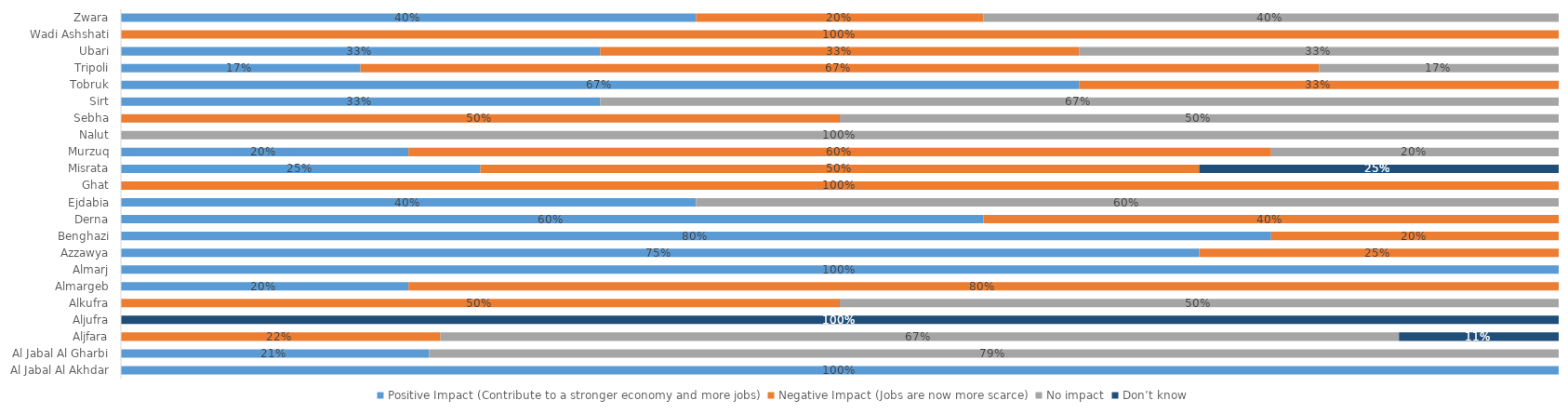
| Category | Positive Impact (Contribute to a stronger economy and more jobs) | Negative Impact (Jobs are now more scarce) | No impact | Don’t know |
|---|---|---|---|---|
| Al Jabal Al Akhdar | 1 | 0 | 0 | 0 |
| Al Jabal Al Gharbi | 0.214 | 0 | 0.786 | 0 |
| Aljfara | 0 | 0.222 | 0.667 | 0.111 |
| Aljufra | 0 | 0 | 0 | 1 |
| Alkufra | 0 | 0.5 | 0.5 | 0 |
| Almargeb | 0.2 | 0.8 | 0 | 0 |
| Almarj | 1 | 0 | 0 | 0 |
| Azzawya | 0.75 | 0.25 | 0 | 0 |
| Benghazi | 0.8 | 0.2 | 0 | 0 |
| Derna | 0.6 | 0.4 | 0 | 0 |
| Ejdabia | 0.4 | 0 | 0.6 | 0 |
| Ghat | 0 | 1 | 0 | 0 |
| Misrata | 0.25 | 0.5 | 0 | 0.25 |
| Murzuq | 0.2 | 0.6 | 0.2 | 0 |
| Nalut | 0 | 0 | 1 | 0 |
| Sebha | 0 | 0.5 | 0.5 | 0 |
| Sirt | 0.333 | 0 | 0.667 | 0 |
| Tobruk | 0.667 | 0.333 | 0 | 0 |
| Tripoli | 0.167 | 0.667 | 0.167 | 0 |
| Ubari | 0.333 | 0.333 | 0.333 | 0 |
| Wadi Ashshati | 0 | 1 | 0 | 0 |
| Zwara | 0.4 | 0.2 | 0.4 | 0 |